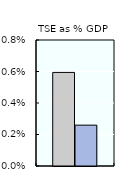
| Category | 2000-02 | 2016-18 |
|---|---|---|
| TSE as % GDP | 0.006 | 0.003 |